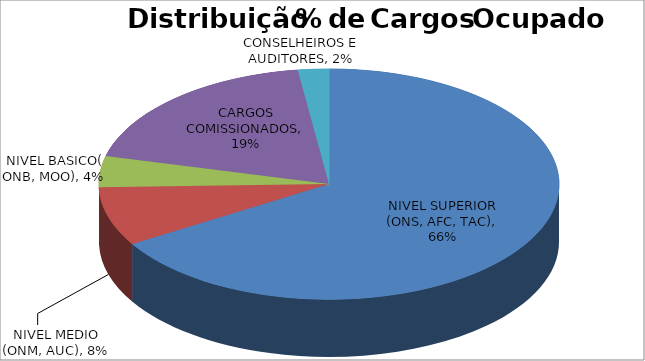
| Category | Series 0 |
|---|---|
| NIVEL SUPERIOR (ONS, AFC, TAC) | 0.663 |
| NIVEL MEDIO (ONM, AUC) | 0.083 |
| NIVEL BASICO( ONB, MOO) | 0.043 |
| CARGOS COMISSIONADOS | 0.189 |
| CONSELHEIROS E AUDITORES | 0.022 |